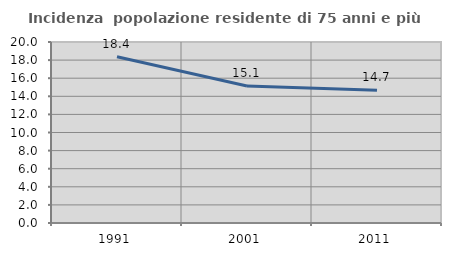
| Category | Incidenza  popolazione residente di 75 anni e più |
|---|---|
| 1991.0 | 18.374 |
| 2001.0 | 15.141 |
| 2011.0 | 14.673 |